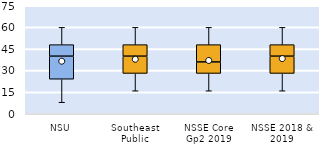
| Category | 25th | 50th | 75th |
|---|---|---|---|
| NSU | 24 | 16 | 8 |
| Southeast Public | 28 | 12 | 8 |
| NSSE Core Gp2 2019 | 28 | 8 | 12 |
| NSSE 2018 & 2019 | 28 | 12 | 8 |